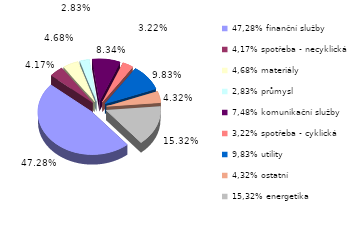
| Category | Series 0 |
|---|---|
| 47,28% finanční služby | 0.473 |
| 4,17% spotřeba - necyklická | 0.042 |
| 4,68% materiály | 0.047 |
| 2,83% průmysl | 0.028 |
| 7,48% komunikační služby | 0.083 |
| 3,22% spotřeba - cyklická | 0.032 |
| 9,83% utility | 0.098 |
| 4,32% ostatní | 0.043 |
| 15,32% energetika | 0.153 |